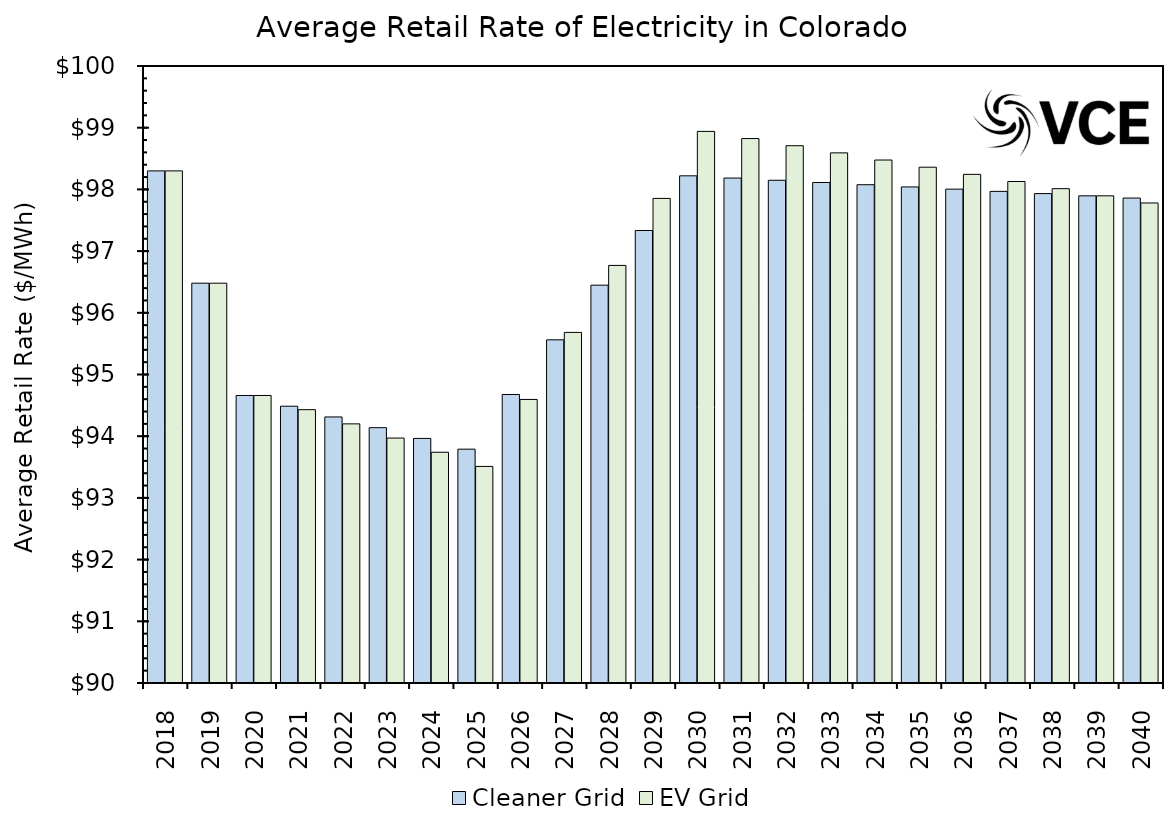
| Category | Cleaner Grid | EV Grid |
|---|---|---|
| 2018.0 | 98.3 | 98.3 |
| 2019.0 | 96.48 | 96.48 |
| 2020.0 | 94.66 | 94.66 |
| 2021.0 | 94.486 | 94.43 |
| 2022.0 | 94.312 | 94.2 |
| 2023.0 | 94.138 | 93.97 |
| 2024.0 | 93.964 | 93.74 |
| 2025.0 | 93.79 | 93.51 |
| 2026.0 | 94.676 | 94.596 |
| 2027.0 | 95.562 | 95.682 |
| 2028.0 | 96.448 | 96.768 |
| 2029.0 | 97.334 | 97.854 |
| 2030.0 | 98.22 | 98.94 |
| 2031.0 | 98.184 | 98.824 |
| 2032.0 | 98.148 | 98.708 |
| 2033.0 | 98.112 | 98.592 |
| 2034.0 | 98.076 | 98.476 |
| 2035.0 | 98.04 | 98.36 |
| 2036.0 | 98.004 | 98.244 |
| 2037.0 | 97.968 | 98.128 |
| 2038.0 | 97.932 | 98.012 |
| 2039.0 | 97.896 | 97.896 |
| 2040.0 | 97.86 | 97.78 |